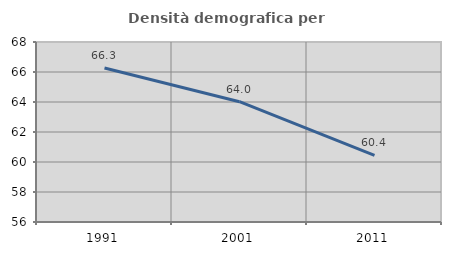
| Category | Densità demografica |
|---|---|
| 1991.0 | 66.27 |
| 2001.0 | 64.022 |
| 2011.0 | 60.435 |